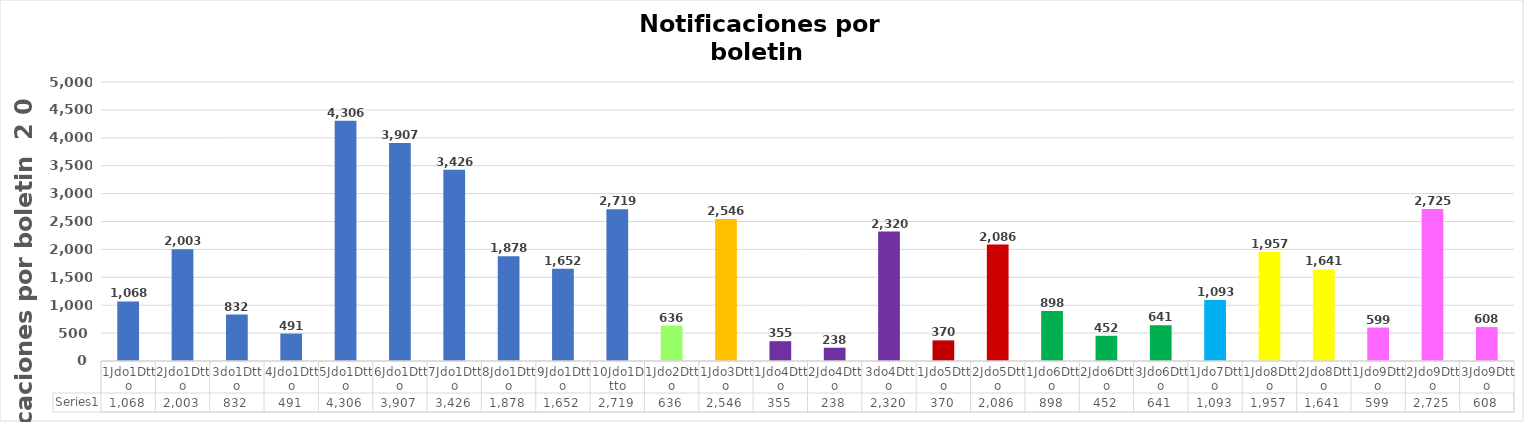
| Category | Series 0 |
|---|---|
| 1Jdo1Dtto | 1068 |
| 2Jdo1Dtto | 2003 |
| 3do1Dtto | 832 |
| 4Jdo1Dtto | 491 |
| 5Jdo1Dtto | 4306 |
| 6Jdo1Dtto | 3907 |
| 7Jdo1Dtto | 3426 |
| 8Jdo1Dtto | 1878 |
| 9Jdo1Dtto | 1652 |
| 10Jdo1Dtto | 2719 |
| 1Jdo2Dtto | 636 |
| 1Jdo3Dtto | 2546 |
| 1Jdo4Dtto | 355 |
| 2Jdo4Dtto | 238 |
| 3do4Dtto | 2320 |
| 1Jdo5Dtto | 370 |
| 2Jdo5Dtto | 2086 |
| 1Jdo6Dtto | 898 |
| 2Jdo6Dtto | 452 |
| 3Jdo6Dtto | 641 |
| 1Jdo7Dtto | 1093 |
| 1Jdo8Dtto | 1957 |
| 2Jdo8Dtto | 1641 |
| 1Jdo9Dtto | 599 |
| 2Jdo9Dtto | 2725 |
| 3Jdo9Dtto | 608 |